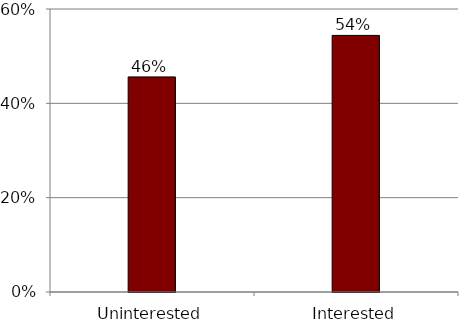
| Category | Series 0 |
|---|---|
| Uninterested | 0.456 |
| Interested | 0.544 |